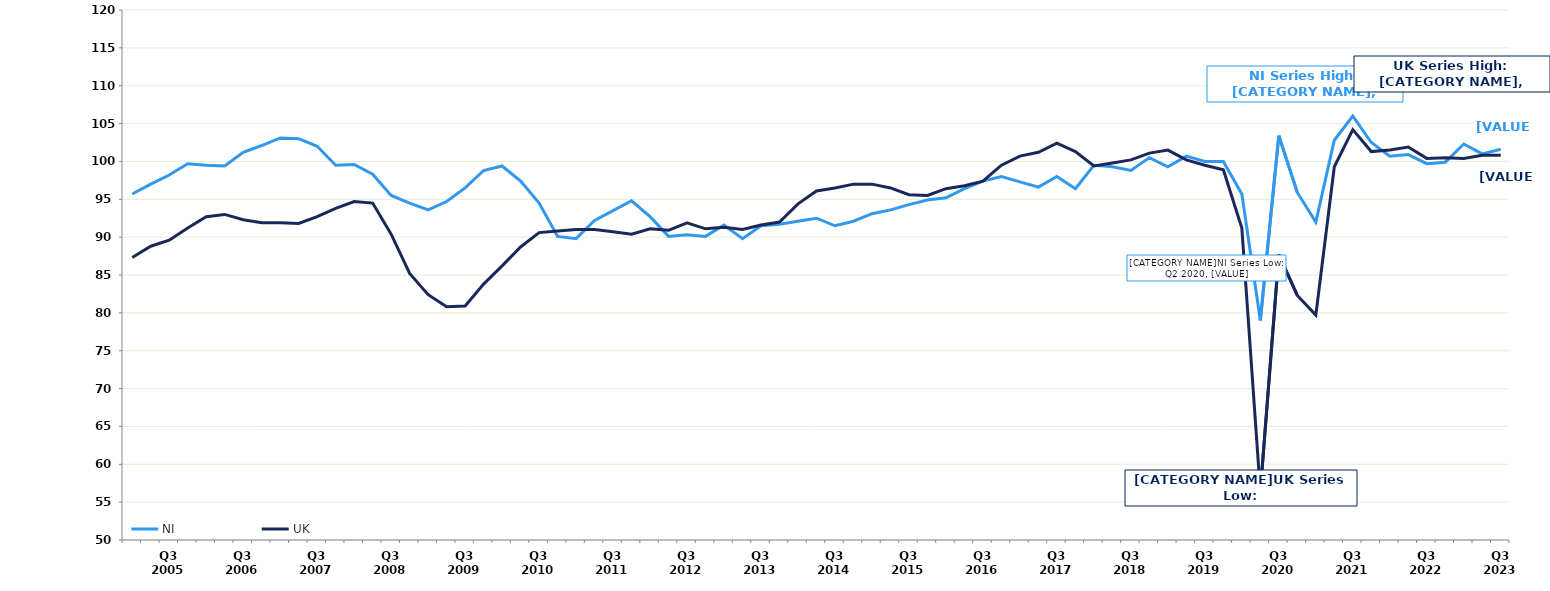
| Category | NI | UK |
|---|---|---|
|  | 95.7 | 87.3 |
|  | 97 | 88.8 |
| Q3 2005 | 98.2 | 89.6 |
|  | 99.7 | 91.2 |
|  | 99.5 | 92.7 |
|  | 99.4 | 93 |
| Q3 2006 | 101.2 | 92.3 |
|  | 102.1 | 91.9 |
|  | 103.1 | 91.9 |
|  | 103 | 91.8 |
| Q3 2007 | 102 | 92.7 |
|  | 99.5 | 93.8 |
|  | 99.6 | 94.7 |
|  | 98.3 | 94.5 |
| Q3 2008 | 95.5 | 90.4 |
|  | 94.5 | 85.2 |
|  | 93.6 | 82.4 |
|  | 94.7 | 80.8 |
| Q3 2009 | 96.5 | 80.9 |
|  | 98.8 | 83.8 |
|  | 99.4 | 86.2 |
|  | 97.4 | 88.7 |
| Q3 2010 | 94.5 | 90.6 |
|  | 90.1 | 90.8 |
|  | 89.8 | 91 |
|  | 92.2 | 91 |
| Q3 2011 | 93.5 | 90.7 |
|  | 94.8 | 90.4 |
|  | 92.7 | 91.1 |
|  | 90.1 | 90.9 |
| Q3 2012 | 90.3 | 91.9 |
|  | 90.1 | 91.1 |
|  | 91.6 | 91.3 |
|  | 89.8 | 91 |
| Q3 2013 | 91.5 | 91.6 |
|  | 91.7 | 92 |
|  | 92.1 | 94.4 |
|  | 92.5 | 96.1 |
| Q3 2014 | 91.5 | 96.5 |
|  | 92.1 | 97 |
|  | 93.1 | 97 |
|  | 93.6 | 96.5 |
| Q3 2015 | 94.3 | 95.6 |
|  | 94.9 | 95.5 |
|  | 95.2 | 96.4 |
|  | 96.4 | 96.8 |
| Q3 2016 | 97.4 | 97.4 |
|  | 98 | 99.5 |
|  | 97.3 | 100.7 |
|  | 96.6 | 101.2 |
| Q3 2017 | 98 | 102.4 |
|  | 96.4 | 101.3 |
|  | 99.5 | 99.4 |
|  | 99.3 | 99.8 |
| Q3 2018 | 98.8 | 100.2 |
|  | 100.5 | 101.1 |
|  | 99.3 | 101.5 |
|  | 100.7 | 100.2 |
| Q3 2019 | 100 | 99.5 |
|  | 100 | 98.9 |
|  | 95.7 | 91.2 |
|  | 79 | 56.4 |
| Q3 2020 | 103.4 | 87.7 |
|  | 95.9 | 82.3 |
|  | 92 | 79.7 |
|  | 102.8 | 99.3 |
| Q3 2021 | 106 | 104.2 |
|  | 102.5 | 101.3 |
|  | 100.7 | 101.5 |
|  | 100.9 | 101.9 |
| Q3 2022 | 99.7 | 100.4 |
|  | 99.9 | 100.5 |
|  | 102.3 | 100.4 |
|  | 101 | 100.8 |
| Q3 2023 | 101.6 | 100.8 |